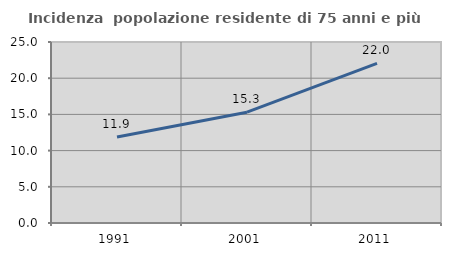
| Category | Incidenza  popolazione residente di 75 anni e più |
|---|---|
| 1991.0 | 11.871 |
| 2001.0 | 15.305 |
| 2011.0 | 22.038 |